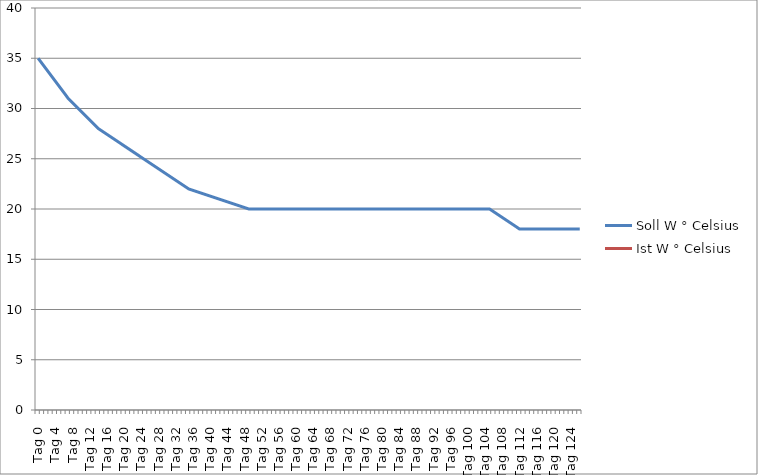
| Category | Soll W ° Celsius | Ist W ° Celsius |
|---|---|---|
| Tag 0 | 35 |  |
| Tag 1 | 34.429 |  |
| Tag 2 | 33.857 |  |
| Tag 3 | 33.286 |  |
| Tag 4 | 32.714 |  |
| Tag 5 | 32.143 |  |
| Tag 6 | 31.571 |  |
| Tag 7 | 31 |  |
| Tag 8 | 30.571 |  |
| Tag 9 | 30.143 |  |
| Tag 10 | 29.714 |  |
| Tag 11 | 29.286 |  |
| Tag 12 | 28.857 |  |
| Tag 13 | 28.429 |  |
| Tag 14 | 28 |  |
| Tag 15 | 27.714 |  |
| Tag 16 | 27.429 |  |
| Tag 17 | 27.143 |  |
| Tag 18 | 26.857 |  |
| Tag 19 | 26.571 |  |
| Tag 20 | 26.286 |  |
| Tag 21 | 26 |  |
| Tag 22 | 25.714 |  |
| Tag 23 | 25.429 |  |
| Tag 24 | 25.143 |  |
| Tag 25 | 24.857 |  |
| Tag 26 | 24.571 |  |
| Tag 27 | 24.286 |  |
| Tag 28 | 24 |  |
| Tag 29 | 23.714 |  |
| Tag 30 | 23.429 |  |
| Tag 31 | 23.143 |  |
| Tag 32 | 22.857 |  |
| Tag 33 | 22.571 |  |
| Tag 34 | 22.286 |  |
| Tag 35 | 22 |  |
| Tag 36 | 21.857 |  |
| Tag 37 | 21.714 |  |
| Tag 38 | 21.571 |  |
| Tag 39 | 21.429 |  |
| Tag 40 | 21.286 |  |
| Tag 41 | 21.143 |  |
| Tag 42 | 21 |  |
| Tag 43 | 20.857 |  |
| Tag 44 | 20.714 |  |
| Tag 45 | 20.571 |  |
| Tag 46 | 20.429 |  |
| Tag 47 | 20.286 |  |
| Tag 48 | 20.143 |  |
| Tag 49 | 20 |  |
| Tag 50 | 20 |  |
| Tag 51 | 20 |  |
| Tag 52 | 20 |  |
| Tag 53 | 20 |  |
| Tag 54 | 20 |  |
| Tag 55 | 20 |  |
| Tag 56 | 20 |  |
| Tag 57 | 20 |  |
| Tag 58 | 20 |  |
| Tag 59 | 20 |  |
| Tag 60 | 20 |  |
| Tag 61 | 20 |  |
| Tag 62 | 20 |  |
| Tag 63 | 20 |  |
| Tag 64 | 20 |  |
| Tag 65 | 20 |  |
| Tag 66 | 20 |  |
| Tag 67 | 20 |  |
| Tag 68 | 20 |  |
| Tag 69 | 20 |  |
| Tag 70 | 20 |  |
| Tag 71 | 20 |  |
| Tag 72 | 20 |  |
| Tag 73 | 20 |  |
| Tag 74 | 20 |  |
| Tag 75 | 20 |  |
| Tag 76 | 20 |  |
| Tag 77 | 20 |  |
| Tag 78 | 20 |  |
| Tag 79 | 20 |  |
| Tag 80 | 20 |  |
| Tag 81 | 20 |  |
| Tag 82 | 20 |  |
| Tag 83 | 20 |  |
| Tag 84 | 20 |  |
| Tag 85 | 20 |  |
| Tag 86 | 20 |  |
| Tag 87 | 20 |  |
| Tag 88 | 20 |  |
| Tag 89 | 20 |  |
| Tag 90 | 20 |  |
| Tag 91 | 20 |  |
| Tag 92 | 20 |  |
| Tag 93 | 20 |  |
| Tag 94 | 20 |  |
| Tag 95 | 20 |  |
| Tag 96 | 20 |  |
| Tag 97 | 20 |  |
| Tag 98 | 20 |  |
| Tag 99 | 20 |  |
| Tag 100 | 20 |  |
| Tag 101 | 20 |  |
| Tag 102 | 20 |  |
| Tag 103 | 20 |  |
| Tag 104 | 20 |  |
| Tag 105 | 20 |  |
| Tag 106 | 19.714 |  |
| Tag 107 | 19.429 |  |
| Tag 108 | 19.143 |  |
| Tag 109 | 18.857 |  |
| Tag 110 | 18.571 |  |
| Tag 111 | 18.286 |  |
| Tag 112 | 18 |  |
| Tag 113 | 18 |  |
| Tag 114 | 18 |  |
| Tag 115 | 18 |  |
| Tag 116 | 18 |  |
| Tag 117 | 18 |  |
| Tag 118 | 18 |  |
| Tag 119 | 18 |  |
| Tag 120 | 18 |  |
| Tag 121 | 18 |  |
| Tag 122 | 18 |  |
| Tag 123 | 18 |  |
| Tag 124 | 18 |  |
| Tag 125 | 18 |  |
| Tag 126 | 18 |  |